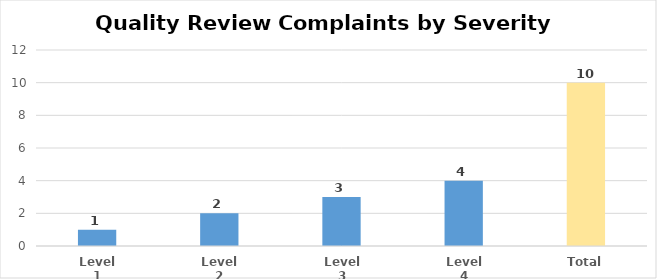
| Category | Referred to Quality Review |
|---|---|
| Level 1 | 1 |
| Level 2 | 2 |
| Level 3 | 3 |
| Level 4 | 4 |
| Total | 10 |